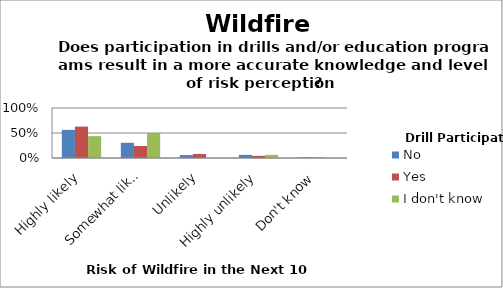
| Category | No | Yes | I don't know |
|---|---|---|---|
| Highly likely | 0.562 | 0.628 | 0.438 |
| Somewhat likely | 0.305 | 0.239 | 0.5 |
| Unlikely | 0.059 | 0.081 | 0 |
| Highly unlikely | 0.062 | 0.043 | 0.062 |
| Don't know | 0.012 | 0.009 | 0 |